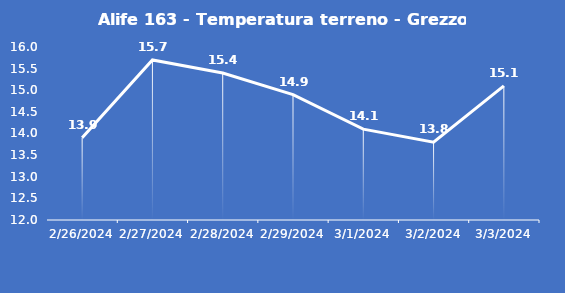
| Category | Alife 163 - Temperatura terreno - Grezzo (°C) |
|---|---|
| 2/26/24 | 13.9 |
| 2/27/24 | 15.7 |
| 2/28/24 | 15.4 |
| 2/29/24 | 14.9 |
| 3/1/24 | 14.1 |
| 3/2/24 | 13.8 |
| 3/3/24 | 15.1 |